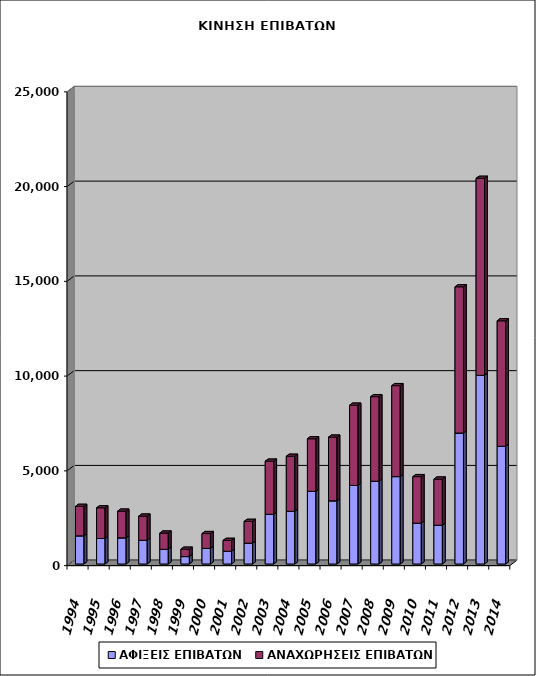
| Category | ΑΦΙΞΕΙΣ ΕΠΙΒΑΤΩΝ | ΑΝΑΧΩΡΗΣΕΙΣ ΕΠΙΒΑΤΩΝ |
|---|---|---|
| 1994.0 | 1485 | 1555 |
| 1995.0 | 1344 | 1619 |
| 1996.0 | 1380 | 1407 |
| 1997.0 | 1250 | 1276 |
| 1998.0 | 773 | 858 |
| 1999.0 | 391 | 387 |
| 2000.0 | 822 | 782 |
| 2001.0 | 671 | 574 |
| 2002.0 | 1098 | 1149 |
| 2003.0 | 2621 | 2804 |
| 2004.0 | 2780 | 2904 |
| 2005.0 | 3835 | 2773 |
| 2006.0 | 3334 | 3359 |
| 2007.0 | 4147 | 4232 |
| 2008.0 | 4368 | 4460 |
| 2009.0 | 4611 | 4799 |
| 2010.0 | 2154 | 2455 |
| 2011.0 | 2045 | 2435 |
| 2012.0 | 6910 | 7717 |
| 2013.0 | 9955 | 10394 |
| 2014.0 | 6211 | 6620 |